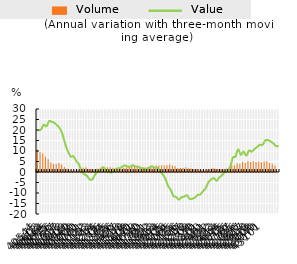
| Category | Volume |
|---|---|
| 0 | 10.655 |
| 1900-01-01 | 9.437 |
| 1900-01-02 | 8.813 |
| 1900-01-03 | 7.31 |
| 1900-01-04 | 6.013 |
| 1900-01-05 | 4.466 |
| 1900-01-06 | 3.817 |
| 1900-01-07 | 3.867 |
| 1900-01-08 | 4.245 |
| 1900-01-09 | 3.603 |
| 1900-01-10 | 2.382 |
| 1900-01-11 | 1.545 |
| 1900-01-12 | 0.689 |
| 1900-01-13 | 0.616 |
| 1900-01-14 | 0.559 |
| 1900-01-15 | 0.995 |
| 1900-01-16 | 1.534 |
| 1900-01-17 | 2.044 |
| 1900-01-18 | 2.221 |
| 1900-01-19 | 1.461 |
| 1900-01-20 | 1.259 |
| 1900-01-21 | 1.156 |
| 1900-01-22 | 1.539 |
| 1900-01-23 | 1.3 |
| 1900-01-24 | 2.029 |
| 1900-01-25 | 2.161 |
| 1900-01-26 | 2.221 |
| 1900-01-27 | 2.306 |
| 1900-01-28 | 1.995 |
| 1900-01-29 | 1.69 |
| 1900-01-30 | 1.129 |
| 1900-01-31 | 1.668 |
| 1900-02-01 | 1.859 |
| 1900-02-02 | 2.314 |
| 1900-02-03 | 2.539 |
| 1900-02-04 | 2.967 |
| 1900-02-05 | 2.631 |
| 1900-02-06 | 2.527 |
| 1900-02-07 | 2.467 |
| 1900-02-08 | 2.418 |
| 1900-02-09 | 2.14 |
| 1900-02-10 | 2.392 |
| 1900-02-11 | 2.641 |
| 1900-02-12 | 2.68 |
| 1900-02-13 | 3.104 |
| 1900-02-14 | 3.127 |
| 1900-02-15 | 3.225 |
| 1900-02-16 | 3.118 |
| 1900-02-17 | 3.166 |
| 1900-02-18 | 3.553 |
| 1900-02-19 | 3.09 |
| 1900-02-20 | 2.757 |
| 1900-02-21 | 1.881 |
| 1900-02-22 | 1.854 |
| 1900-02-23 | 1.872 |
| 1900-02-24 | 2.266 |
| 1900-02-25 | 1.771 |
| 1900-02-26 | 1.679 |
| 1900-02-27 | 1.371 |
| 1900-02-28 | 1.478 |
| 1900-02-28 | 0.822 |
| 1900-03-01 | 0.844 |
| 1900-03-02 | 0.641 |
| 1900-03-03 | 1.208 |
| 1900-03-04 | 1.554 |
| 1900-03-05 | 1.913 |
| 1900-03-06 | 1.498 |
| 1900-03-07 | 1.45 |
| 1900-03-08 | 1.307 |
| 1900-03-09 | 1.275 |
| 1900-03-10 | 1.624 |
| 1900-03-11 | 2.221 |
| 1900-03-12 | 3.465 |
| 1900-03-13 | 3.103 |
| 1900-03-14 | 4.077 |
| 1900-03-15 | 3.765 |
| 1900-03-16 | 4.929 |
| 1900-03-17 | 4.317 |
| 1900-03-18 | 5.109 |
| 1900-03-19 | 4.817 |
| 1900-03-20 | 5.16 |
| 1900-03-21 | 4.81 |
| 1900-03-22 | 4.951 |
| 1900-03-23 | 4.691 |
| 1900-03-24 | 5.108 |
| 1900-03-25 | 5.126 |
| 1900-03-26 | 4.265 |
| 1900-03-27 | 3.889 |
| 1900-03-28 | 3.133 |